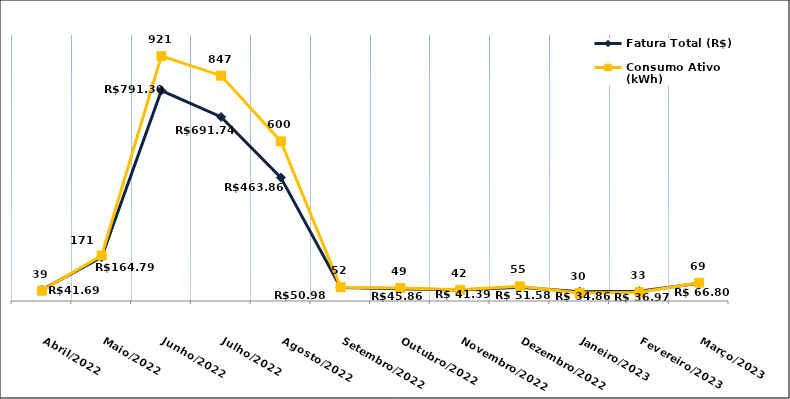
| Category | Fatura Total (R$) |
|---|---|
| Abril/2022 | 41.69 |
| Maio/2022 | 164.79 |
| Junho/2022 | 791.3 |
| Julho/2022 | 691.74 |
| Agosto/2022 | 463.86 |
| Setembro/2022 | 50.98 |
| Outubro/2022 | 45.86 |
| Novembro/2022 | 41.39 |
| Dezembro/2022 | 51.58 |
| Janeiro/2023 | 34.86 |
| Fevereiro/2023 | 36.97 |
| Março/2023 | 66.8 |